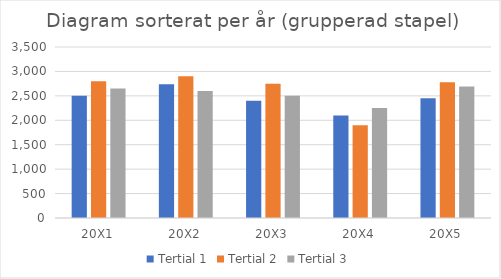
| Category | Tertial 1 | Tertial 2 | Tertial 3 |
|---|---|---|---|
| 20X1 | 2500 | 2800 | 2650 |
| 20X2 | 2740 | 2900 | 2600 |
| 20X3 | 2400 | 2750 | 2500 |
| 20X4 | 2100 | 1900 | 2250 |
| 20X5 | 2450 | 2780 | 2690 |